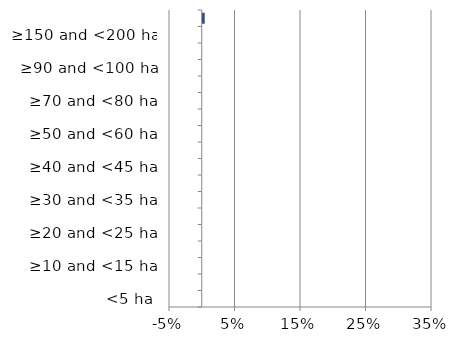
| Category | England | Scotland | Wales |
|---|---|---|---|
| <5 ha | 0 | 0 | 0 |
| ≥5 and <10 ha | 0 | 0 | 0 |
| ≥10 and <15 ha | 0 | 0 | 0 |
| ≥15 and <20 ha | 0 | 0 | 0 |
| ≥20 and <25 ha | 0 | 0 | 0 |
| ≥25 and <30 ha | 0 | 0 | 0 |
| ≥30 and <35 ha | 0 | 0 | 0 |
| ≥35 and <40 ha | 0 | 0 | 0 |
| ≥40 and <45 ha | 0 | 0 | 0 |
| ≥45 and <50 ha | 0 | 0 | 0 |
| ≥50 and <60 ha | 0 | 0 | 0 |
| ≥60 and <70 ha | 0 | 0 | 0 |
| ≥70 and <80 ha | 0 | 0 | 0 |
| ≥80 and <90 ha | 0 | 0 | 0 |
| ≥90 and <100 ha | 0 | 0 | 0 |
| ≥100 and <150 ha | 0 | 0 | 0 |
| ≥150 and <200 ha | 0 | 0 | 0 |
| ≥200 ha | 0 | 0.004 | 0 |